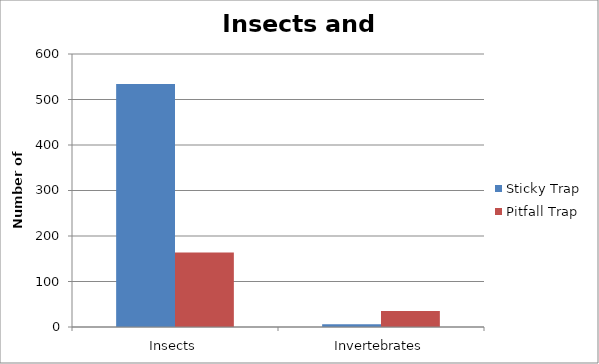
| Category | Sticky Trap | Pitfall Trap |
|---|---|---|
| 0 | 534 | 164 |
| 1 | 6 | 35 |